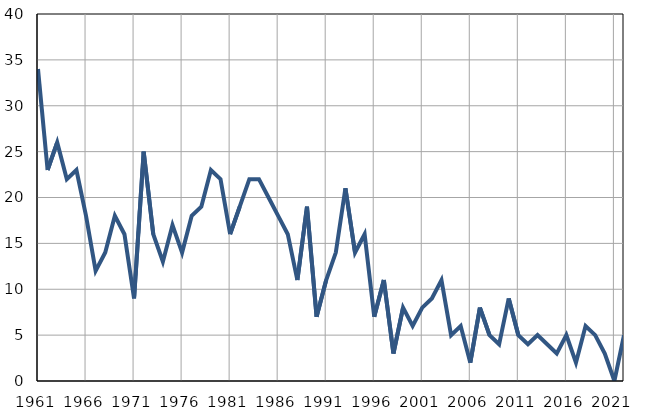
| Category | Infants
deaths |
|---|---|
| 1961.0 | 34 |
| 1962.0 | 23 |
| 1963.0 | 26 |
| 1964.0 | 22 |
| 1965.0 | 23 |
| 1966.0 | 18 |
| 1967.0 | 12 |
| 1968.0 | 14 |
| 1969.0 | 18 |
| 1970.0 | 16 |
| 1971.0 | 9 |
| 1972.0 | 25 |
| 1973.0 | 16 |
| 1974.0 | 13 |
| 1975.0 | 17 |
| 1976.0 | 14 |
| 1977.0 | 18 |
| 1978.0 | 19 |
| 1979.0 | 23 |
| 1980.0 | 22 |
| 1981.0 | 16 |
| 1982.0 | 19 |
| 1983.0 | 22 |
| 1984.0 | 22 |
| 1985.0 | 20 |
| 1986.0 | 18 |
| 1987.0 | 16 |
| 1988.0 | 11 |
| 1989.0 | 19 |
| 1990.0 | 7 |
| 1991.0 | 11 |
| 1992.0 | 14 |
| 1993.0 | 21 |
| 1994.0 | 14 |
| 1995.0 | 16 |
| 1996.0 | 7 |
| 1997.0 | 11 |
| 1998.0 | 3 |
| 1999.0 | 8 |
| 2000.0 | 6 |
| 2001.0 | 8 |
| 2002.0 | 9 |
| 2003.0 | 11 |
| 2004.0 | 5 |
| 2005.0 | 6 |
| 2006.0 | 2 |
| 2007.0 | 8 |
| 2008.0 | 5 |
| 2009.0 | 4 |
| 2010.0 | 9 |
| 2011.0 | 5 |
| 2012.0 | 4 |
| 2013.0 | 5 |
| 2014.0 | 4 |
| 2015.0 | 3 |
| 2016.0 | 5 |
| 2017.0 | 2 |
| 2018.0 | 6 |
| 2019.0 | 5 |
| 2020.0 | 3 |
| 2021.0 | 0 |
| 2022.0 | 5 |